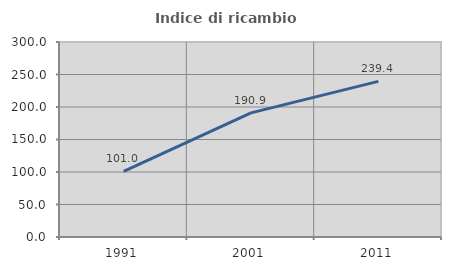
| Category | Indice di ricambio occupazionale  |
|---|---|
| 1991.0 | 100.971 |
| 2001.0 | 190.909 |
| 2011.0 | 239.394 |